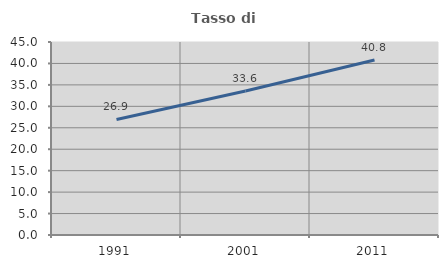
| Category | Tasso di occupazione   |
|---|---|
| 1991.0 | 26.939 |
| 2001.0 | 33.588 |
| 2011.0 | 40.816 |